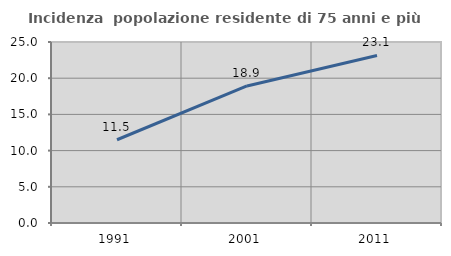
| Category | Incidenza  popolazione residente di 75 anni e più |
|---|---|
| 1991.0 | 11.498 |
| 2001.0 | 18.93 |
| 2011.0 | 23.144 |